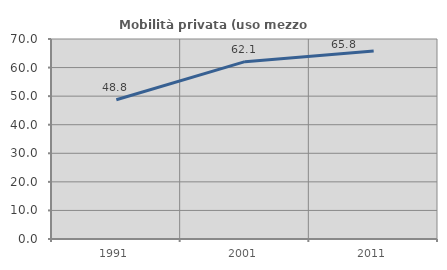
| Category | Mobilità privata (uso mezzo privato) |
|---|---|
| 1991.0 | 48.757 |
| 2001.0 | 62.075 |
| 2011.0 | 65.764 |